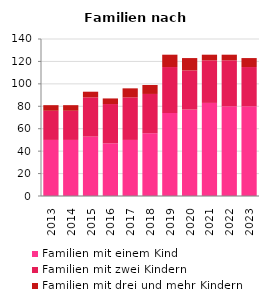
| Category | Familien mit einem Kind | Familien mit zwei Kindern | Familien mit drei und mehr Kindern |
|---|---|---|---|
| 2013.0 | 50 | 26 | 5 |
| 2014.0 | 50 | 26 | 5 |
| 2015.0 | 53 | 35 | 5 |
| 2016.0 | 47 | 35 | 5 |
| 2017.0 | 50 | 38 | 8 |
| 2018.0 | 56 | 35 | 8 |
| 2019.0 | 74 | 41 | 11 |
| 2020.0 | 77 | 35 | 11 |
| 2021.0 | 83 | 38 | 5 |
| 2022.0 | 80 | 41 | 5 |
| 2023.0 | 80 | 35 | 8 |